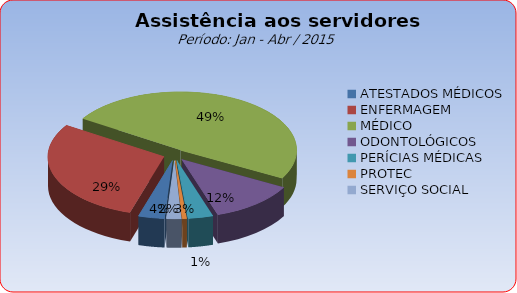
| Category | Series 0 |
|---|---|
| ATESTADOS MÉDICOS | 3.624 |
| ENFERMAGEM | 29.352 |
| MÉDICO | 48.903 |
| ODONTOLÓGICOS | 11.996 |
| PERÍCIAS MÉDICAS | 3.471 |
| PROTEC | 0.613 |
| SERVIÇO SOCIAL | 2.042 |